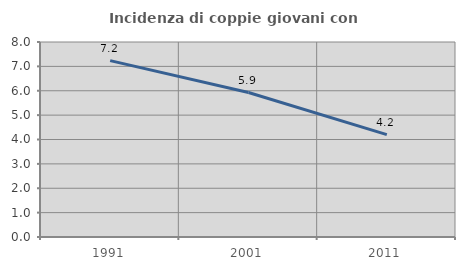
| Category | Incidenza di coppie giovani con figli |
|---|---|
| 1991.0 | 7.237 |
| 2001.0 | 5.926 |
| 2011.0 | 4.202 |